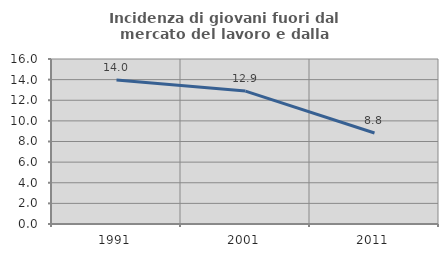
| Category | Incidenza di giovani fuori dal mercato del lavoro e dalla formazione  |
|---|---|
| 1991.0 | 13.974 |
| 2001.0 | 12.887 |
| 2011.0 | 8.824 |